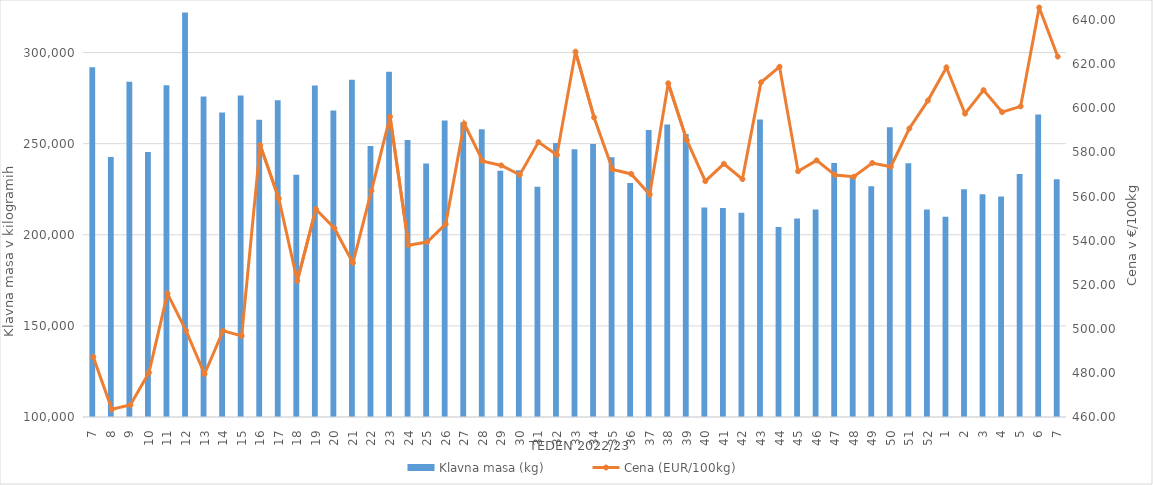
| Category | Klavna masa (kg) |
|---|---|
| 7.0 | 291887 |
| 8.0 | 242732 |
| 9.0 | 283987 |
| 10.0 | 245414 |
| 11.0 | 282092 |
| 12.0 | 321936 |
| 13.0 | 275950 |
| 14.0 | 267148 |
| 15.0 | 276417 |
| 16.0 | 263098 |
| 17.0 | 273824 |
| 18.0 | 232926 |
| 19.0 | 281859 |
| 20.0 | 268153 |
| 21.0 | 285073 |
| 22.0 | 248783 |
| 23.0 | 289478 |
| 24.0 | 252069 |
| 25.0 | 239099 |
| 26.0 | 262689 |
| 27.0 | 261656 |
| 28.0 | 257905 |
| 29.0 | 235185 |
| 30.0 | 235475 |
| 31.0 | 226322 |
| 32.0 | 250418 |
| 33.0 | 246996 |
| 34.0 | 249873 |
| 35.0 | 242516 |
| 36.0 | 228469 |
| 37.0 | 257511 |
| 38.0 | 260481 |
| 39.0 | 255370 |
| 40.0 | 214936 |
| 41.0 | 214672 |
| 42.0 | 212066 |
| 43.0 | 263287 |
| 44.0 | 204280 |
| 45.0 | 208920 |
| 46.0 | 213836 |
| 47.0 | 239417 |
| 48.0 | 231565 |
| 49.0 | 226575 |
| 50.0 | 259073 |
| 51.0 | 239211 |
| 52.0 | 213841 |
| 1.0 | 209877 |
| 2.0 | 225045 |
| 3.0 | 222198 |
| 4.0 | 221002 |
| 5.0 | 233306 |
| 6.0 | 265944 |
| 7.0 | 230531 |